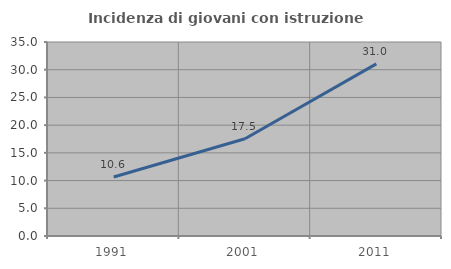
| Category | Incidenza di giovani con istruzione universitaria |
|---|---|
| 1991.0 | 10.638 |
| 2001.0 | 17.547 |
| 2011.0 | 31.046 |